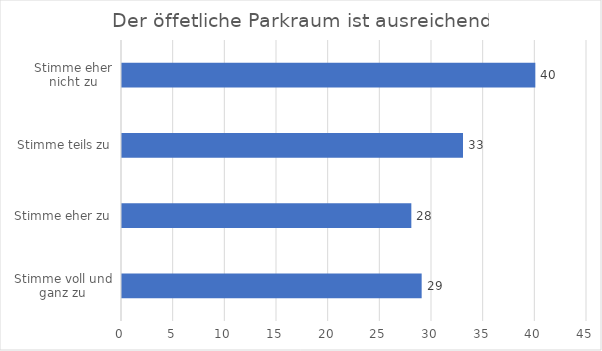
| Category | Series 0 |
|---|---|
| Stimme voll und ganz zu | 29 |
| Stimme eher zu | 28 |
| Stimme teils zu | 33 |
| Stimme eher nicht zu | 40 |